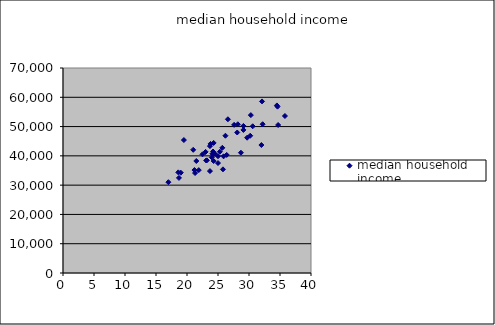
| Category | median household income |
|---|---|
| 21.2 | 35158 |
| 26.6 | 52499 |
| 24.3 | 40762 |
| 19.0 | 34246 |
| 29.1 | 50220 |
| 34.7 | 50538 |
| 34.6 | 56803 |
| 27.6 | 50583 |
| 25.0 | 39871 |
| 25.7 | 42742 |
| 28.2 | 50787 |
| 24.0 | 39492 |
| 28.1 | 47977 |
| 21.0 | 42067 |
| 22.5 | 40526 |
| 28.7 | 41075 |
| 18.6 | 34368 |
| 21.3 | 34141 |
| 25.9 | 39838 |
| 34.5 | 57218 |
| 35.8 | 53610 |
| 24.3 | 44407 |
| 30.6 | 50100 |
| 18.7 | 32466 |
| 24.1 | 40725 |
| 25.8 | 35399 |
| 25.3 | 41406 |
| 19.5 | 45395 |
| 30.3 | 53910 |
| 32.1 | 58588 |
| 23.7 | 34805 |
| 29.7 | 46195 |
| 24.3 | 38234 |
| 25.0 | 37554 |
| 23.0 | 41350 |
| 21.9 | 35129 |
| 26.4 | 40319 |
| 24.2 | 41478 |
| 29.1 | 48854 |
| 23.2 | 38467 |
| 23.1 | 38415 |
| 21.5 | 38247 |
| 24.5 | 40674 |
| 26.2 | 46873 |
| 32.0 | 43697 |
| 32.2 | 50805 |
| 30.2 | 46868 |
| 17.0 | 31008 |
| 23.8 | 44084 |
| 23.7 | 43332 |